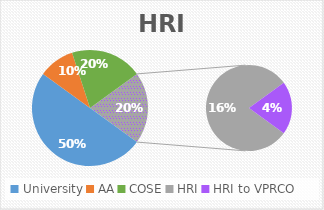
| Category | HRI Subdistribtion |
|---|---|
| University | 0.5 |
| AA | 0.1 |
| COSE | 0.2 |
| HRI | 0.16 |
| HRI to VPRCO | 0.04 |